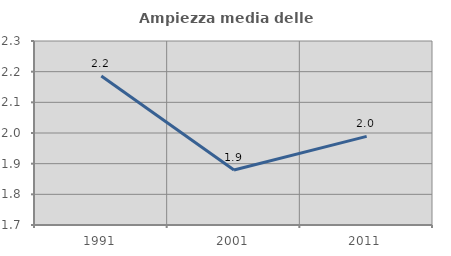
| Category | Ampiezza media delle famiglie |
|---|---|
| 1991.0 | 2.186 |
| 2001.0 | 1.879 |
| 2011.0 | 1.989 |